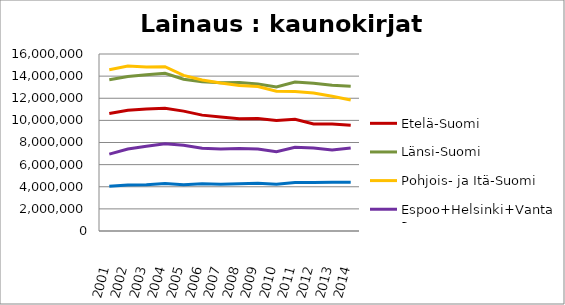
| Category | Etelä-Suomi | Länsi-Suomi | Pohjois- ja Itä-Suomi | Espoo+Helsinki+Vantaa | Muu Uusimaa |
|---|---|---|---|---|---|
| 2001.0 | 10613808 | 13673683 | 14568155 | 6951658 | 4042637 |
| 2002.0 | 10915150 | 13975089 | 14904556 | 7407228 | 4165939 |
| 2003.0 | 11019724 | 14126054 | 14829027 | 7663134 | 4189883 |
| 2004.0 | 11092615 | 14254117 | 14849992 | 7878072 | 4304162 |
| 2005.0 | 10834713 | 13722708 | 14065282 | 7748423 | 4179688 |
| 2006.0 | 10473302 | 13501811 | 13657222 | 7472458 | 4261451 |
| 2007.0 | 10298590 | 13394458 | 13369416 | 7422937 | 4224800 |
| 2008.0 | 10139091 | 13413689 | 13143284 | 7461650 | 4270150 |
| 2009.0 | 10161134 | 13296458 | 13055171 | 7413439 | 4309113 |
| 2010.0 | 9988068 | 13018119 | 12630907 | 7169706 | 4235654 |
| 2011.0 | 10108331 | 13465334 | 12599818 | 7577232 | 4390940 |
| 2012.0 | 9672416 | 13352426 | 12483593 | 7510566 | 4387140 |
| 2013.0 | 9661054 | 13166341 | 12175738 | 7315935 | 4409048 |
| 2014.0 | 9557136 | 13085479 | 11839223 | 7497829 | 4406182 |